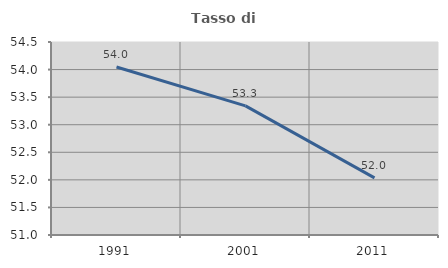
| Category | Tasso di occupazione   |
|---|---|
| 1991.0 | 54.047 |
| 2001.0 | 53.341 |
| 2011.0 | 52.036 |